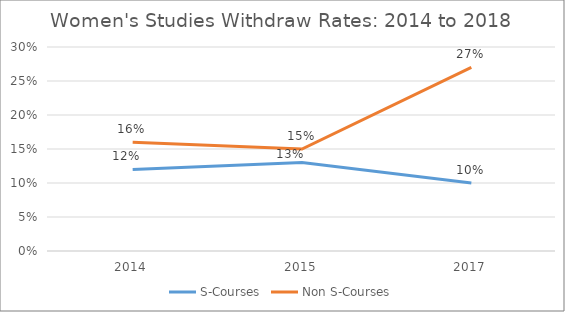
| Category | S-Courses | Non S-Courses |
|---|---|---|
| 2014.0 | 0.12 | 0.16 |
| 2015.0 | 0.13 | 0.15 |
| 2017.0 | 0.1 | 0.27 |